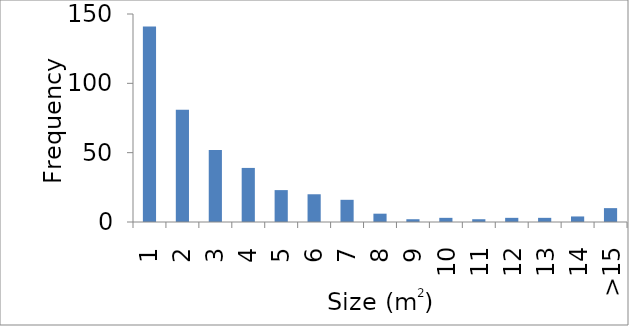
| Category | Frequency |
|---|---|
| 1 | 141 |
| 2 | 81 |
| 3 | 52 |
| 4 | 39 |
| 5 | 23 |
| 6 | 20 |
| 7 | 16 |
| 8 | 6 |
| 9 | 2 |
| 10 | 3 |
| 11 | 2 |
| 12 | 3 |
| 13 | 3 |
| 14 | 4 |
| >15 | 10 |